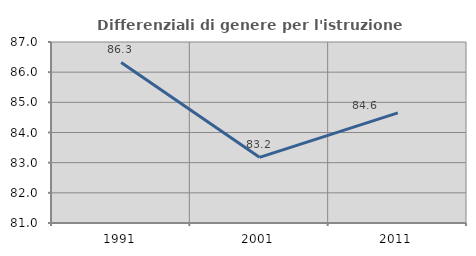
| Category | Differenziali di genere per l'istruzione superiore |
|---|---|
| 1991.0 | 86.322 |
| 2001.0 | 83.178 |
| 2011.0 | 84.649 |